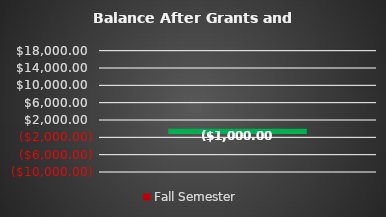
| Category | Fall Semester |
|---|---|
| 0 | -1000 |